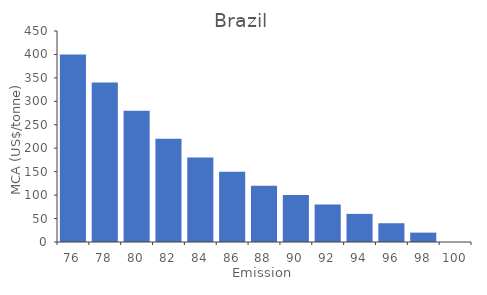
| Category | TCA (million $) |
|---|---|
| 76.0 | 400 |
| 78.0 | 340 |
| 80.0 | 280 |
| 82.0 | 220 |
| 84.0 | 180 |
| 86.0 | 150 |
| 88.0 | 120 |
| 90.0 | 100 |
| 92.0 | 80 |
| 94.0 | 60 |
| 96.0 | 40 |
| 98.0 | 20 |
| 100.0 | 0 |